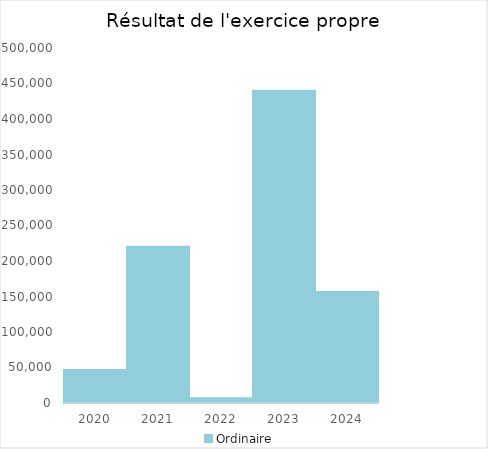
| Category |   | Ordinaire |    |
|---|---|---|---|
| 2020.0 |  | 46647.09 |  |
| 2021.0 |  | 220207.77 |  |
| 2022.0 |  | 6649.85 |  |
| 2023.0 |  | 439670.04 |  |
| 2024.0 |  | 156307.82 |  |